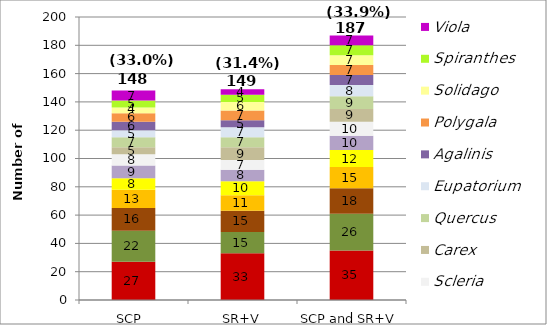
| Category | Rhynchospora | Dichanthelium | Juncus  | Hypericum | Xyris  | Andropogon  | Scleria | Carex | Quercus | Eupatorium | Agalinis | Polygala | Solidago | Spiranthes | Viola |
|---|---|---|---|---|---|---|---|---|---|---|---|---|---|---|---|
| SCP  | 27 | 22 | 16 | 13 | 8 | 9 | 8 | 5 | 7 | 5 | 6 | 6 | 4 | 5 | 7 |
| SR+V | 33 | 15 | 15 | 11 | 10 | 8 | 7 | 9 | 7 | 7 | 5 | 7 | 6 | 5 | 4 |
| SCP and SR+V | 35 | 26 | 18 | 15 | 12 | 10 | 10 | 9 | 9 | 8 | 7 | 7 | 7 | 7 | 7 |